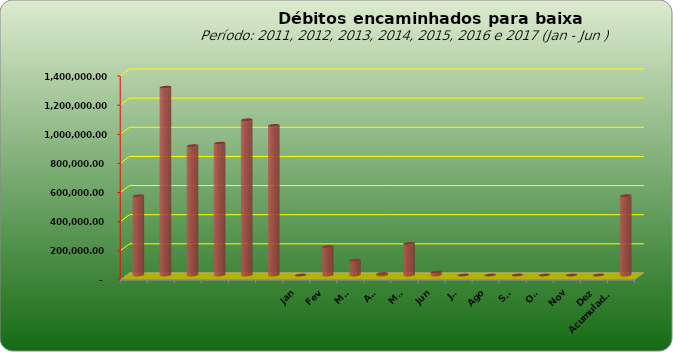
| Category |  543.796,20  |
|---|---|
|  | 543796.2 |
|  | 1289053.69 |
|  | 887573.08 |
|  | 905052.31 |
|  | 1065434.28 |
|  | 1027209.41 |
| Jan | 0 |
| Fev | 195564.55 |
| Mar | 101757.11 |
| Abr | 10195.55 |
| Mai | 217067.29 |
| Jun | 19848.93 |
| Jul | 0 |
| Ago | 0 |
| Set | 0 |
| Out | 0 |
| Nov | 0 |
| Dez | 0 |
| Acumulado
2016 | 544433.43 |